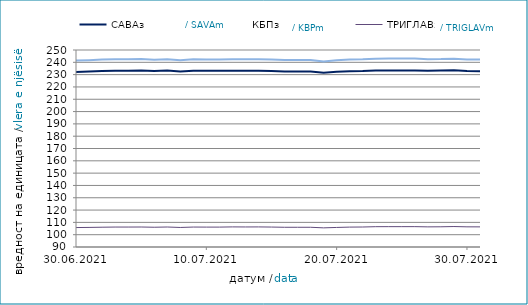
| Category | САВАз | КБПз | ТРИГЛАВз |
|---|---|---|---|
| 2021-06-30 | 232.209 | 241.445 | 105.787 |
| 2021-07-01 | 232.513 | 241.763 | 105.907 |
| 2021-07-02 | 232.938 | 242.207 | 106.075 |
| 2021-07-03 | 233.213 | 242.572 | 106.195 |
| 2021-07-04 | 233.225 | 242.585 | 106.199 |
| 2021-07-05 | 233.29 | 242.68 | 106.231 |
| 2021-07-06 | 232.916 | 242.115 | 106.047 |
| 2021-07-07 | 233.255 | 242.565 | 106.24 |
| 2021-07-08 | 232.526 | 241.688 | 105.865 |
| 2021-07-09 | 233.167 | 242.441 | 106.199 |
| 2021-07-10 | 233.06 | 242.3 | 106.157 |
| 2021-07-11 | 233.072 | 242.313 | 106.161 |
| 2021-07-12 | 233.204 | 242.58 | 106.33 |
| 2021-07-13 | 233.062 | 242.4 | 106.271 |
| 2021-07-14 | 233.233 | 242.519 | 106.308 |
| 2021-07-15 | 233.041 | 242.341 | 106.201 |
| 2021-07-16 | 232.534 | 241.806 | 106.016 |
| 2021-07-17 | 232.531 | 241.817 | 106.022 |
| 2021-07-18 | 232.544 | 241.83 | 106.026 |
| 2021-07-19 | 231.457 | 240.676 | 105.55 |
| 2021-07-20 | 232.261 | 241.616 | 105.886 |
| 2021-07-21 | 232.715 | 242.19 | 106.16 |
| 2021-07-22 | 232.89 | 242.403 | 106.234 |
| 2021-07-23 | 233.353 | 242.974 | 106.51 |
| 2021-07-24 | 233.39 | 243.025 | 106.527 |
| 2021-07-25 | 233.402 | 243.038 | 106.531 |
| 2021-07-26 | 233.443 | 243.035 | 106.544 |
| 2021-07-27 | 233.065 | 242.497 | 106.354 |
| 2021-07-28 | 233.279 | 242.601 | 106.414 |
| 2021-07-29 | 233.51 | 242.992 | 106.617 |
| 2021-07-30 | 232.88 | 242.273 | 106.374 |
| 2021-07-31 | 232.832 | 242.197 | 106.349 |